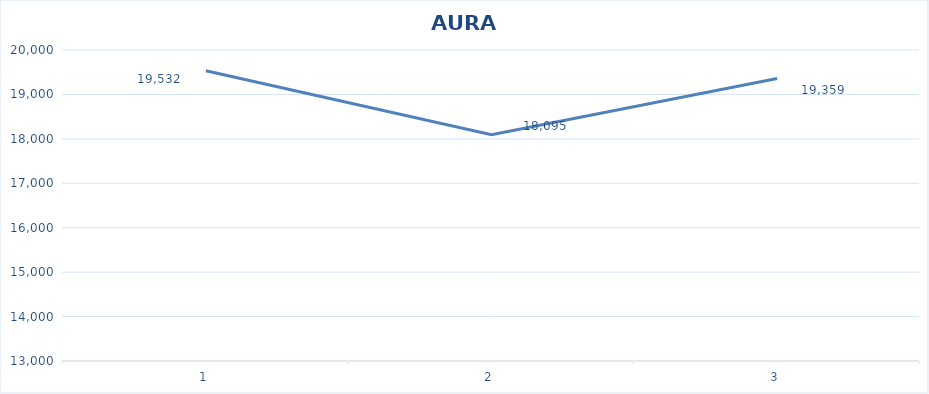
| Category | AURA TOTAL |
|---|---|
| 0 | 19532 |
| 1 | 18095 |
| 2 | 19359 |